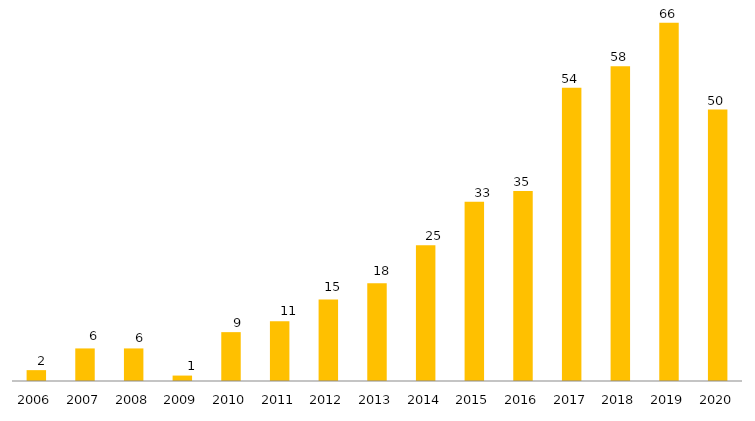
| Category | Monografias - Artigos Científicos / Dissertações / Teses |
|---|---|
| 2006.0 | 2 |
| 2007.0 | 6 |
| 2008.0 | 6 |
| 2009.0 | 1 |
| 2010.0 | 9 |
| 2011.0 | 11 |
| 2012.0 | 15 |
| 2013.0 | 18 |
| 2014.0 | 25 |
| 2015.0 | 33 |
| 2016.0 | 35 |
| 2017.0 | 54 |
| 2018.0 | 58 |
| 2019.0 | 66 |
| 2020.0 | 50 |